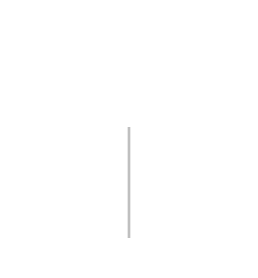
| Category | Positive | Negative |
|---|---|---|
| 0 | 0 | 0 |
| 1 | 0 | 0 |
| 2 | 0 | 0 |